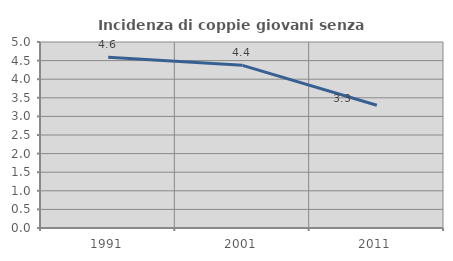
| Category | Incidenza di coppie giovani senza figli |
|---|---|
| 1991.0 | 4.592 |
| 2001.0 | 4.373 |
| 2011.0 | 3.301 |